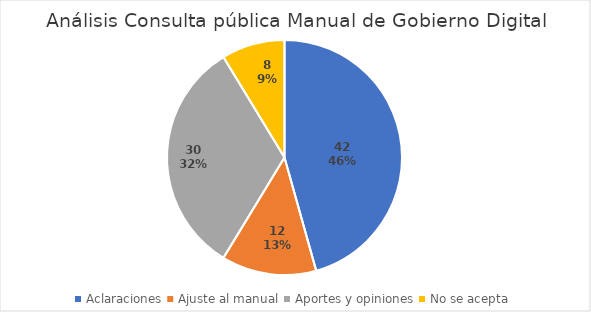
| Category | Cantidad |
|---|---|
| Aclaraciones | 42 |
| Ajuste al manual | 12 |
| Aportes y opiniones | 30 |
| No se acepta | 8 |